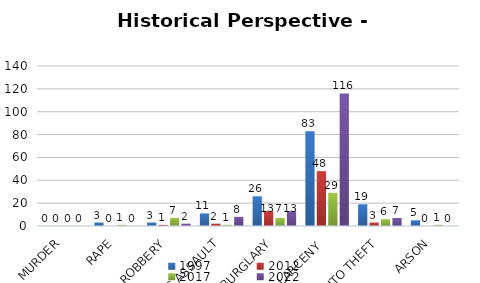
| Category | 1997 | 2012 | 2017 | 2022 |
|---|---|---|---|---|
| MURDER | 0 | 0 | 0 | 0 |
| RAPE | 3 | 0 | 1 | 0 |
| ROBBERY | 3 | 1 | 7 | 2 |
| AGG ASSAULT | 11 | 2 | 1 | 8 |
| BURGLARY | 26 | 13 | 7 | 13 |
| LARCENY  | 83 | 48 | 29 | 116 |
| AUTO THEFT | 19 | 3 | 6 | 7 |
| ARSON | 5 | 0 | 1 | 0 |